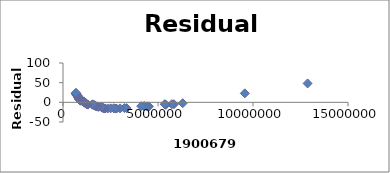
| Category | Series 0 |
|---|---|
| 12872808.0 | 48.062 |
| 9569624.0 | 22.799 |
| 6300006.0 | -2.197 |
| 5838471.0 | -4.867 |
| 5728143.0 | -4.744 |
| 5414772.0 | -6.235 |
| 5376285.0 | -5.541 |
| 5358130.0 | -4.686 |
| 4522858.0 | -10.327 |
| 4425110.0 | -10.104 |
| 4281899.0 | -10.243 |
| 4274531.0 | -9.301 |
| 4115871.0 | -9.563 |
| 3344813.0 | -14.693 |
| 3229878.0 | -14.607 |
| 3001072.0 | -15.426 |
| 2816710.0 | -15.892 |
| 2733761.0 | -15.551 |
| 2667117.0 | -15.081 |
| 2506626.0 | -15.357 |
| 2351192.0 | -15.593 |
| 2207462.0 | -15.736 |
| 2155137.0 | -15.152 |
| 2109832.0 | -14.512 |
| 2088291.0 | -13.683 |
| 2054574.0 | -12.952 |
| 2031445.0 | -12.135 |
| 2002047.0 | -11.369 |
| 1865746.0 | -11.453 |
| 1819198.0 | -10.823 |
| 1773120.0 | -10.189 |
| 1715459.0 | -9.648 |
| 1701799.0 | -8.756 |
| 1658292.0 | -8.102 |
| 1652602.0 | -7.148 |
| 1600611.0 | -6.561 |
| 1550733.0 | -5.957 |
| 1549308.0 | -4.969 |
| 1313228.0 | -5.846 |
| 1285732.0 | -5.064 |
| 1244696.0 | -4.391 |
| 1225626.0 | -3.542 |
| 1206142.0 | -2.697 |
| 1190512.0 | -1.822 |
| 1134029.0 | -1.271 |
| 1124309.0 | -0.348 |
| 1117608.0 | 0.599 |
| 1115692.0 | 1.584 |
| 1088765.0 | 2.37 |
| 1034090.0 | 2.935 |
| 1012018.0 | 3.759 |
| 916079.0 | 3.997 |
| 909153.0 | 4.941 |
| 905034.0 | 5.909 |
| 895030.0 | 6.829 |
| 853919.0 | 7.502 |
| 846101.0 | 8.44 |
| 845913.0 | 9.439 |
| 837925.0 | 10.375 |
| 836544.0 | 11.364 |
| 808210.0 | 12.139 |
| 800458.0 | 13.077 |
| 797740.0 | 14.056 |
| 781352.0 | 14.925 |
| 776742.0 | 15.889 |
| 770037.0 | 16.835 |
| 734669.0 | 17.554 |
| 716030.0 | 18.406 |
| 710514.0 | 19.362 |
| 699356.0 | 20.273 |
| 698497.0 | 21.267 |
| 687181.0 | 22.177 |
| 682657.0 | 23.141 |
| 681525.0 | 24.132 |